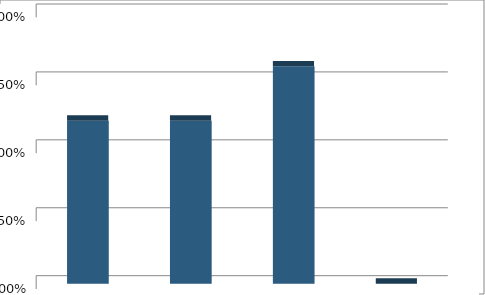
| Category | Series1 |
|---|---|
| Alternative Future #1: Low Intensity | 0.3 |
| Alternative Future #2: Medium Intensity | 0.3 |
| Alternative Future #3: High Intensity | 0.4 |
| None of the Above | 0 |